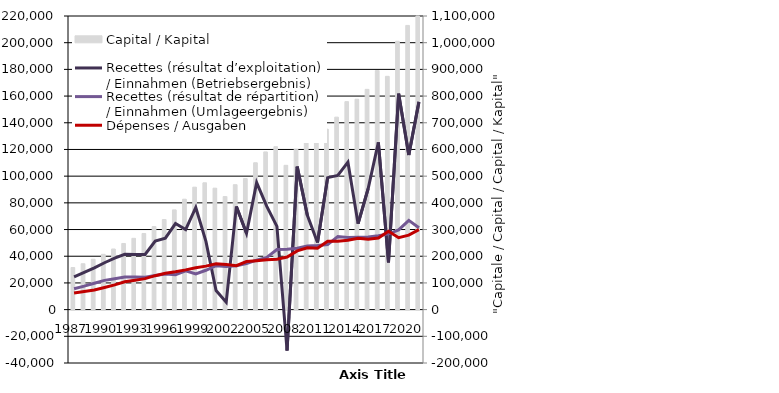
| Category | Capital / Kapital |
|---|---|
| 1987.0 | 157621.002 |
| 1988.0 | 171901 |
| 1989.0 | 188573 |
| 1990.0 | 207173 |
| 1991.0 | 227139 |
| 1992.0 | 247727.046 |
| 1993.0 | 267069.1 |
| 1994.0 | 285172.888 |
| 1995.0 | 311105.202 |
| 1996.0 | 337474 |
| 1997.0 | 373605.318 |
| 1998.0 | 413605 |
| 1999.0 | 458755.204 |
| 2000.0 | 475022 |
| 2001.0 | 455000 |
| 2002.0 | 423591 |
| 2003.0 | 468000 |
| 2004.0 | 491090.608 |
| 2005.0 | 550099.802 |
| 2006.0 | 590829.605 |
| 2007.0 | 610382.132 |
| 2008.0 | 540609.027 |
| 2009.0 | 600944.99 |
| 2010.0 | 625427.147 |
| 2011.0 | 628841.786 |
| 2012.0 | 675964.858 |
| 2013.0 | 721054.129 |
| 2014.0 | 779181.064 |
| 2015.0 | 788177.395 |
| 2016.0 | 825124.244 |
| 2017.0 | 895597.154 |
| 2018.0 | 874000.636 |
| 2019.0 | 1005321.265 |
| 2020.0 | 1064589.86 |
| 2021.0 | 1161710.304 |